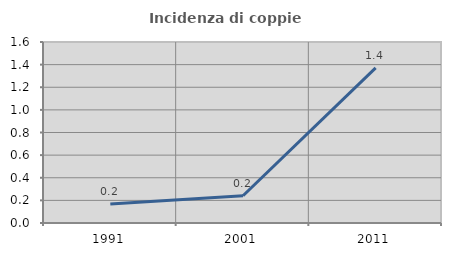
| Category | Incidenza di coppie miste |
|---|---|
| 1991.0 | 0.168 |
| 2001.0 | 0.241 |
| 2011.0 | 1.372 |